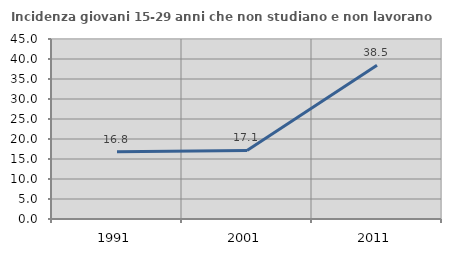
| Category | Incidenza giovani 15-29 anni che non studiano e non lavorano  |
|---|---|
| 1991.0 | 16.837 |
| 2001.0 | 17.143 |
| 2011.0 | 38.462 |